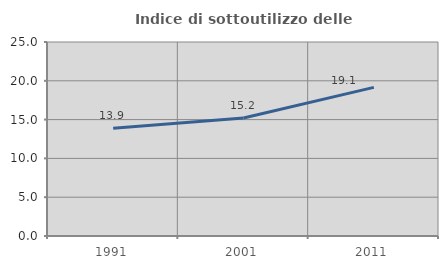
| Category | Indice di sottoutilizzo delle abitazioni  |
|---|---|
| 1991.0 | 13.9 |
| 2001.0 | 15.209 |
| 2011.0 | 19.149 |